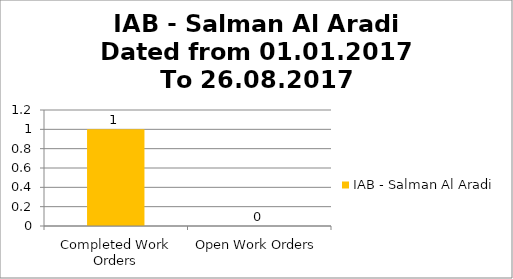
| Category | IAB - Salman Al Aradi |
|---|---|
| Completed Work Orders | 1 |
| Open Work Orders | 0 |